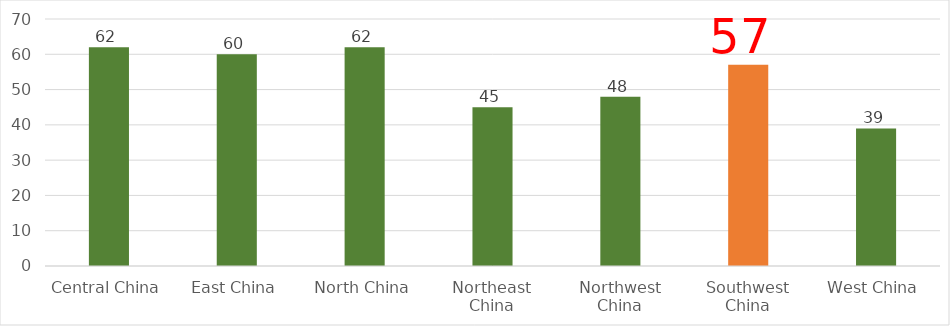
| Category | Series 0 |
|---|---|
| Central China | 62 |
| East China | 60 |
| North China | 62 |
| Northeast China | 45 |
| Northwest China | 48 |
| Southwest China | 57 |
| West China | 39 |